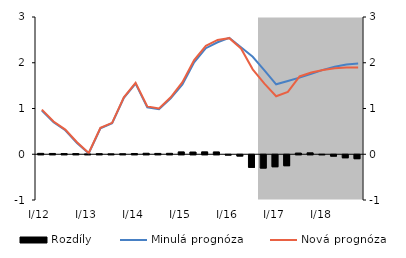
| Category | Rozdíly |
|---|---|
| I/12 | 0.02 |
| II | 0.018 |
| III | 0.015 |
| IV | 0.014 |
| I/13 | 0.007 |
| II | 0.013 |
| III | 0.009 |
| IV | 0.011 |
| I/14 | 0.017 |
| II | 0.022 |
| III | 0.018 |
| IV | 0.02 |
| I/15 | 0.052 |
| II | 0.049 |
| III | 0.053 |
| IV | 0.051 |
| I/16 | -0.007 |
| II | -0.027 |
| III | -0.275 |
| IV | -0.29 |
| I/17 | -0.262 |
| II | -0.239 |
| III | 0.026 |
| IV | 0.031 |
| I/18 | -0.001 |
| II | -0.029 |
| III | -0.065 |
| IV | -0.086 |